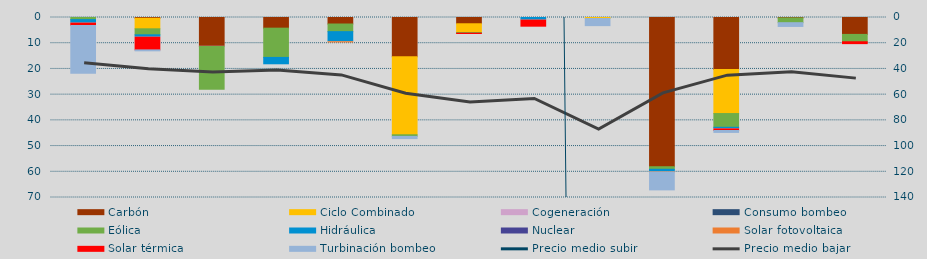
| Category | Carbón | Ciclo Combinado | Cogeneración | Consumo bombeo | Eólica | Hidráulica | Nuclear | Solar fotovoltaica | Solar térmica | Turbinación bombeo |
|---|---|---|---|---|---|---|---|---|---|---|
| 0 | 0 | 0 | 0 |  | 822 | 1360.8 |  | 0 | 899 | 18605.4 |
| 1 | 294 | 4100.8 | 0 |  | 2338.3 | 921.3 |  | 0 | 4944.9 | 366.7 |
| 2 | 11178.1 | 0 | 91.5 |  | 16656.7 | 0 |  | 0 | 0 | 0 |
| 3 | 4145.2 | 0 | 0 |  | 11379.4 | 2865.3 |  | 0 | 0 | 0 |
| 4 | 2530 | 0 | 0 |  | 2970.9 | 3920 |  | 95.9 | 0 | 0 |
| 5 | 15307.2 | 30295.6 | 0 |  | 607.6 | 24 |  | 0 | 0 | 856 |
| 6 | 2438 | 3386 | 0 |  | 274 | 0 |  | 0 | 117.8 | 0 |
| 7 | 0 | 0 | 0 |  | 0 | 1009.1 |  | 0 | 2368.1 | 0 |
| 8 | 0 | 400 | 0 |  | 0 | 0 |  | 0 | 0 | 2763.2 |
| 9 | 58033.7 | 0 | 0 |  | 988.1 | 1026.5 |  | 57.8 | 0 | 6933.6 |
| 10 | 20255.7 | 17094 | 0 |  | 5344.3 | 623 |  | 0 | 617.6 | 755.1 |
| 11 | 158.4 | 0 | 0 |  | 1844.3 | 12 |  | 0 | 0 | 1460 |
| 12 | 6575 | 0 | 0 |  | 2859 | 0 |  | 0 | 725.3 | 0 |